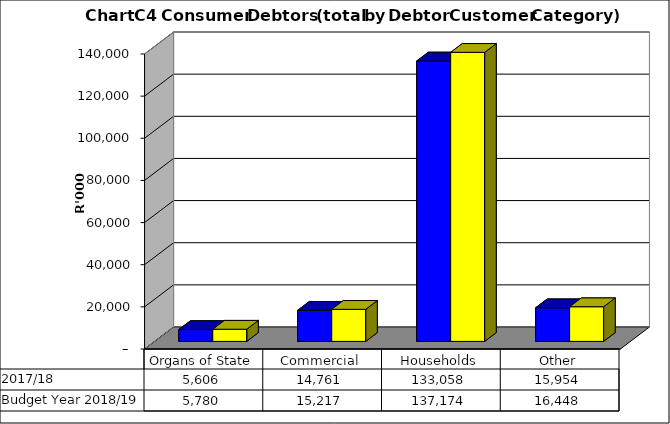
| Category |  2017/18  | Budget Year 2018/19 |
|---|---|---|
| Organs of State | 5606412.868 | 5779807.08 |
| Commercial | 14760664.222 | 15217179.61 |
| Households | 133058471.86 | 137173682.33 |
| Other | 15954161.437 | 16447589.11 |